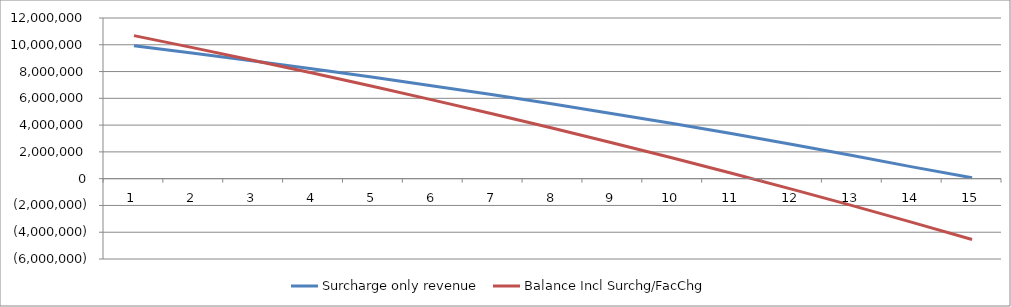
| Category | Surcharge only revenue | Balance Incl Surchg/FacChg  |
|---|---|---|
| 0 | 9930959.482 | 10682678.185 |
| 1 | 9371326.138 | 9768446.246 |
| 2 | 8791788.341 | 8830620.556 |
| 3 | 8191638.151 | 7868493.175 |
| 4 | 7570142.447 | 6881330.983 |
| 5 | 6926542.034 | 5868374.785 |
| 6 | 6260050.716 | 4828838.384 |
| 7 | 5569854.333 | 3761907.62 |
| 8 | 4855109.767 | 2666739.376 |
| 9 | 4114943.915 | 1542460.548 |
| 10 | 3348452.619 | 388166.978 |
| 11 | 2554699.563 | -797077.649 |
| 12 | 1732715.129 | -2014242.951 |
| 13 | 881495.214 | -3264333.033 |
| 14 | 74640.309 | -4548387.71 |